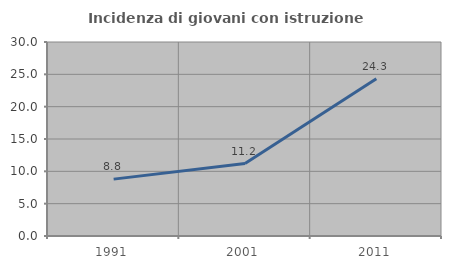
| Category | Incidenza di giovani con istruzione universitaria |
|---|---|
| 1991.0 | 8.795 |
| 2001.0 | 11.209 |
| 2011.0 | 24.324 |